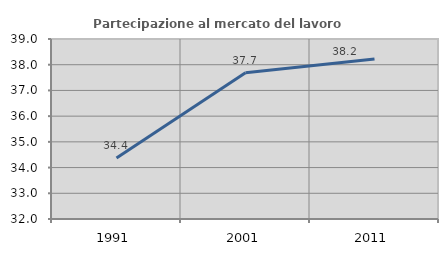
| Category | Partecipazione al mercato del lavoro  femminile |
|---|---|
| 1991.0 | 34.368 |
| 2001.0 | 37.691 |
| 2011.0 | 38.223 |